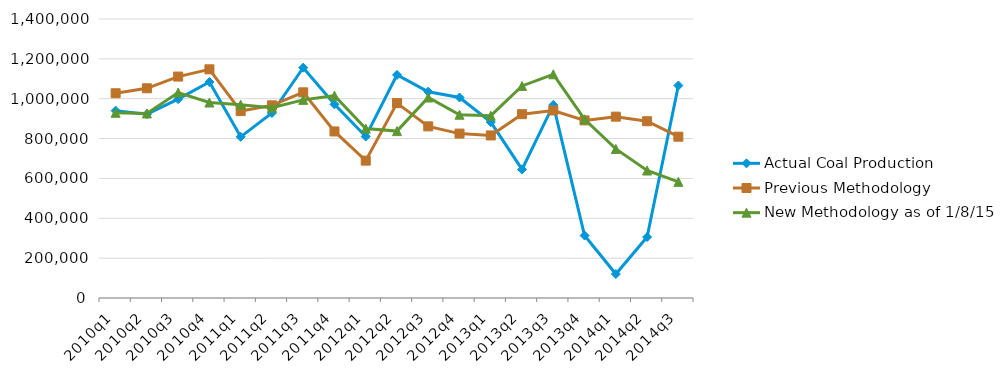
| Category | Actual Coal Production | Previous Methodology | New Methodology as of 1/8/15 |
|---|---|---|---|
| 2010q1 | 940000 | 1027357 | 929361 |
| 2010q2 | 922678 | 1052282 | 926119 |
| 2010q3 | 997935 | 1111082 | 1030933 |
| 2010q4 | 1083929 | 1147513 | 980808 |
| 2011q1 | 808684 | 938028 | 970080 |
| 2011q2 | 928392 | 966668 | 954595 |
| 2011q3 | 1155783 | 1031972 | 994295 |
| 2011q4 | 971841 | 835797 | 1015178 |
| 2012q1 | 810378 | 689262 | 850038 |
| 2012q2 | 1119396 | 977900 | 837399 |
| 2012q3 | 1035213 | 861264 | 1006190 |
| 2012q4 | 1006142 | 825011 | 919655 |
| 2013q1 | 882483 | 815751 | 914721 |
| 2013q2 | 645095 | 922325 | 1064052 |
| 2013q3 | 968862 | 941103 | 1122585 |
| 2013q4 | 313331 | 891286 | 896714 |
| 2014q1 | 120117 | 909948 | 747949 |
| 2014q2 | 305663 | 886961 | 639717 |
| 2014q3 | 1066165 | 809411 | 582876 |